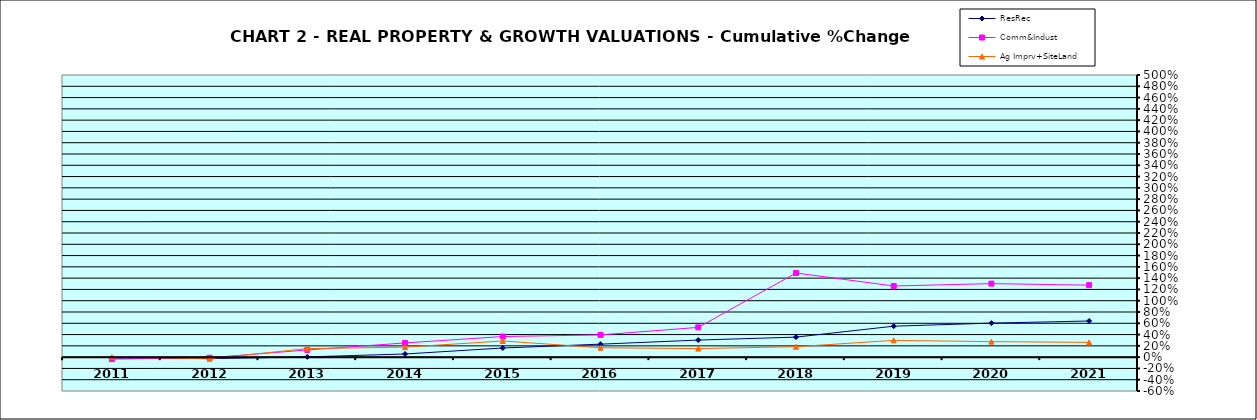
| Category | ResRec | Comm&Indust | Ag Imprv+SiteLand |
|---|---|---|---|
| 2011.0 | -0.013 | -0.035 | 0 |
| 2012.0 | -0.026 | -0.01 | -0.028 |
| 2013.0 | 0.004 | 0.127 | 0.151 |
| 2014.0 | 0.056 | 0.252 | 0.177 |
| 2015.0 | 0.162 | 0.365 | 0.286 |
| 2016.0 | 0.23 | 0.394 | 0.167 |
| 2017.0 | 0.303 | 0.527 | 0.152 |
| 2018.0 | 0.355 | 1.491 | 0.185 |
| 2019.0 | 0.549 | 1.261 | 0.297 |
| 2020.0 | 0.603 | 1.303 | 0.275 |
| 2021.0 | 0.641 | 1.276 | 0.262 |